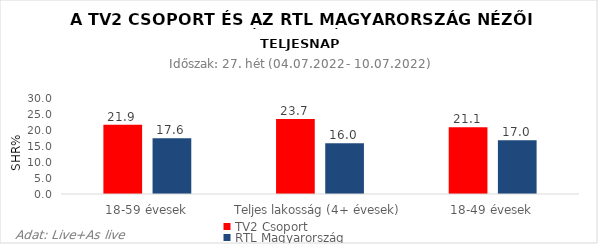
| Category | TV2 Csoport | RTL Magyarország |
|---|---|---|
| 18-59 évesek | 21.9 | 17.6 |
| Teljes lakosság (4+ évesek) | 23.7 | 16 |
| 18-49 évesek | 21.1 | 17 |